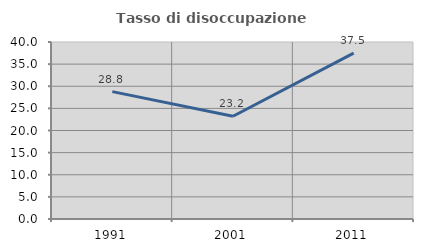
| Category | Tasso di disoccupazione giovanile  |
|---|---|
| 1991.0 | 28.788 |
| 2001.0 | 23.214 |
| 2011.0 | 37.5 |